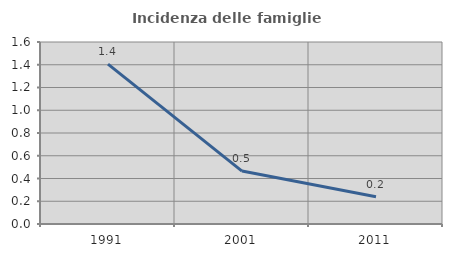
| Category | Incidenza delle famiglie numerose |
|---|---|
| 1991.0 | 1.406 |
| 2001.0 | 0.465 |
| 2011.0 | 0.24 |